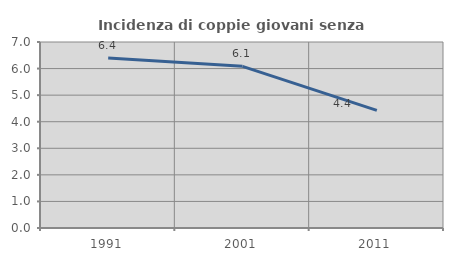
| Category | Incidenza di coppie giovani senza figli |
|---|---|
| 1991.0 | 6.395 |
| 2001.0 | 6.085 |
| 2011.0 | 4.424 |